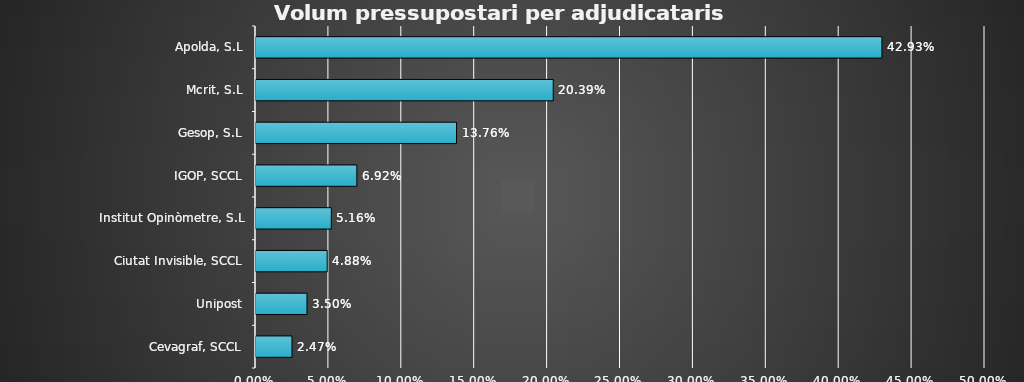
| Category | Series 0 |
|---|---|
| Cevagraf, SCCL | 0.025 |
| Unipost | 0.035 |
| Ciutat Invisible, SCCL | 0.049 |
| Institut Opinòmetre, S.L | 0.052 |
| IGOP, SCCL | 0.069 |
| Gesop, S.L | 0.138 |
| Mcrit, S.L | 0.204 |
| Apolda, S.L | 0.429 |